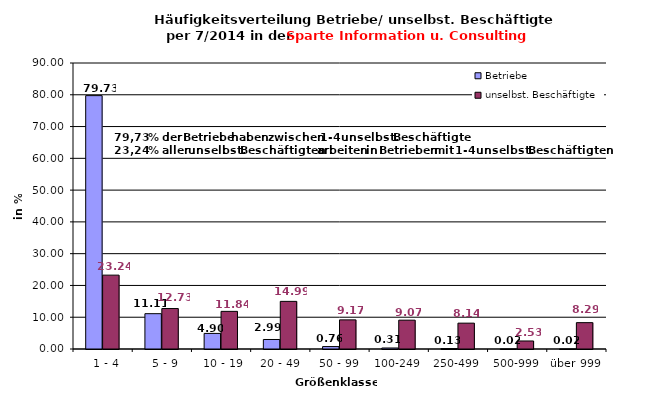
| Category | Betriebe | unselbst. Beschäftigte |
|---|---|---|
|   1 - 4 | 79.73 | 23.242 |
|   5 - 9 | 11.114 | 12.731 |
|  10 - 19 | 4.904 | 11.84 |
| 20 - 49 | 2.992 | 14.991 |
| 50 - 99 | 0.765 | 9.167 |
| 100-249 | 0.315 | 9.075 |
| 250-499 | 0.135 | 8.136 |
| 500-999 | 0.022 | 2.526 |
| über 999 | 0.022 | 8.291 |